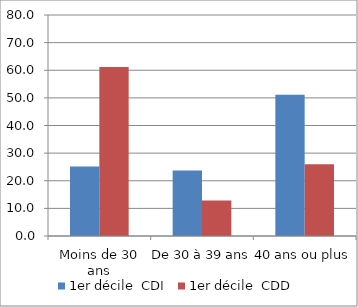
| Category | 1er décile  CDI | 1er décile  CDD |
|---|---|---|
| Moins de 30 ans | 25.166 | 61.186 |
| De 30 à 39 ans | 23.733 | 12.844 |
| 40 ans ou plus | 51.102 | 25.97 |